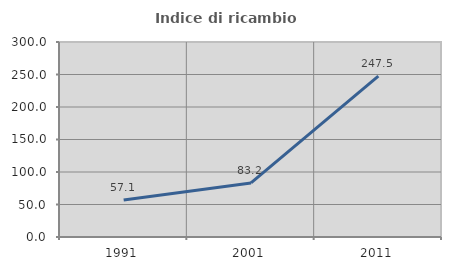
| Category | Indice di ricambio occupazionale  |
|---|---|
| 1991.0 | 57.074 |
| 2001.0 | 83.207 |
| 2011.0 | 247.453 |